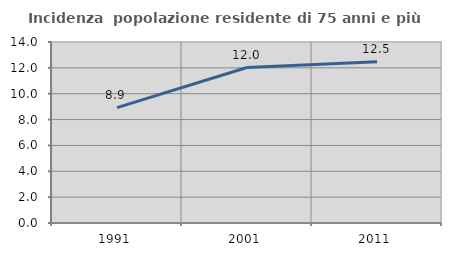
| Category | Incidenza  popolazione residente di 75 anni e più |
|---|---|
| 1991.0 | 8.929 |
| 2001.0 | 12.023 |
| 2011.0 | 12.47 |